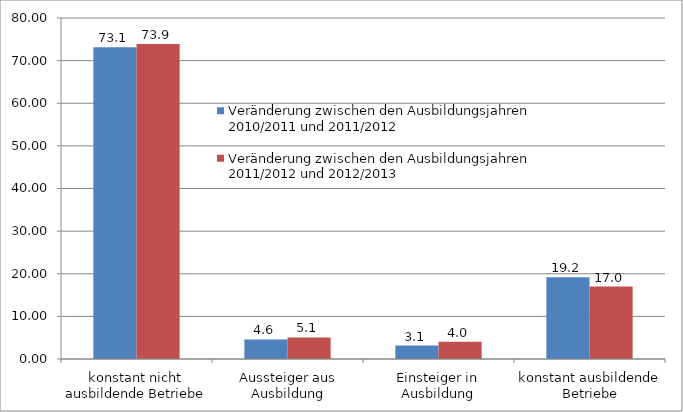
| Category | Veränderung zwischen den Ausbildungsjahren 2010/2011 und 2011/2012 | Veränderung zwischen den Ausbildungsjahren 2011/2012 und 2012/2013 |
|---|---|---|
| konstant nicht ausbildende Betriebe | 73.12 | 73.91 |
| Aussteiger aus Ausbildung | 4.58 | 5.06 |
| Einsteiger in Ausbildung | 3.14 | 4.04 |
| konstant ausbildende Betriebe | 19.16 | 16.99 |